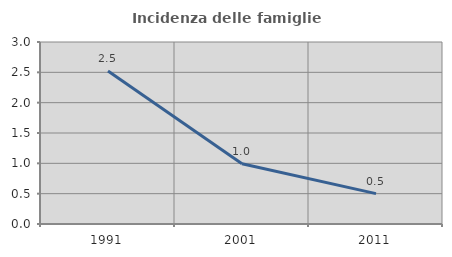
| Category | Incidenza delle famiglie numerose |
|---|---|
| 1991.0 | 2.522 |
| 2001.0 | 0.992 |
| 2011.0 | 0.501 |